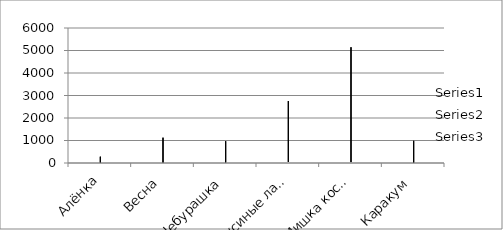
| Category | Series 0 | Series 1 | Series 2 |
|---|---|---|---|
| Алёнка | 10 | 28 | 280 |
| Весна | 15 | 75 | 1125 |
| Чебурашка | 20 | 48.5 | 970 |
| Гусиные лапки | 45 | 61.2 | 2754 |
| Мишка косолапый | 40 | 128.6 | 5144 |
| Каракум | 10 | 98.5 | 985 |